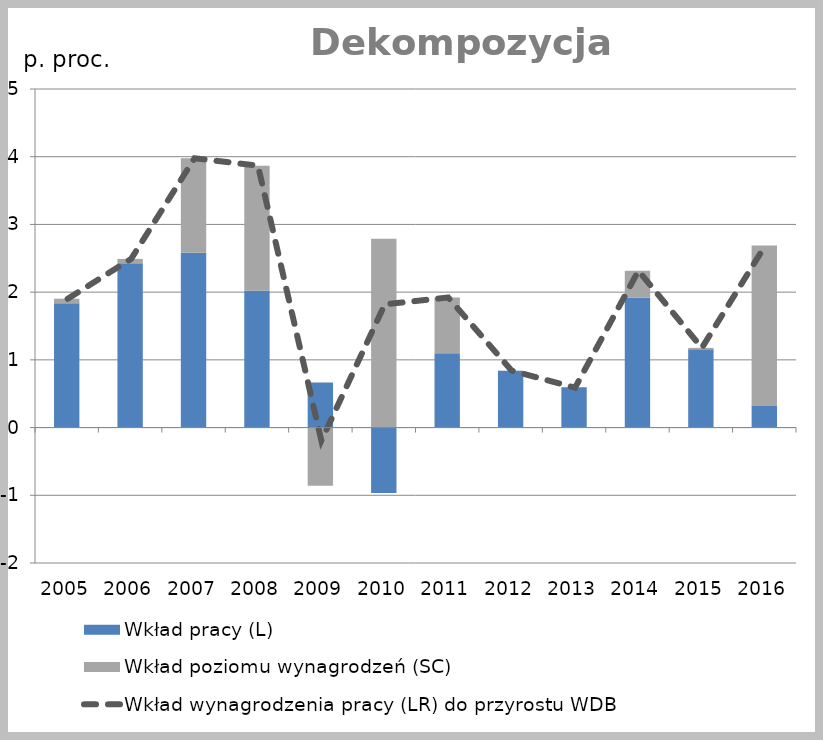
| Category | Wkład pracy (L) | Wkład poziomu wynagrodzeń (SC) |
|---|---|---|
| 2005.0 | 1.836 | 0.067 |
| 2006.0 | 2.425 | 0.066 |
| 2007.0 | 2.58 | 1.397 |
| 2008.0 | 2.019 | 1.849 |
| 2009.0 | 0.665 | -0.859 |
| 2010.0 | -0.968 | 2.787 |
| 2011.0 | 1.097 | 0.824 |
| 2012.0 | 0.84 | 0.001 |
| 2013.0 | 0.595 | -0.006 |
| 2014.0 | 1.922 | 0.394 |
| 2015.0 | 1.155 | 0.022 |
| 2016.0 | 0.32 | 2.37 |